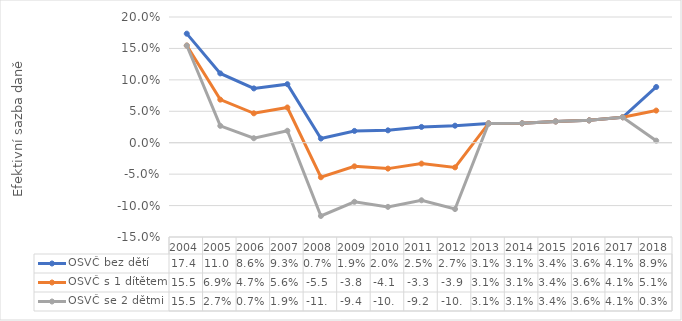
| Category | OSVČ bez dětí | OSVČ s 1 dítětem | OSVČ se 2 dětmi |
|---|---|---|---|
| 2004.0 | 0.174 | 0.155 | 0.155 |
| 2005.0 | 0.11 | 0.069 | 0.027 |
| 2006.0 | 0.086 | 0.047 | 0.007 |
| 2007.0 | 0.093 | 0.056 | 0.019 |
| 2008.0 | 0.007 | -0.055 | -0.117 |
| 2009.0 | 0.019 | -0.038 | -0.094 |
| 2010.0 | 0.02 | -0.041 | -0.102 |
| 2011.0 | 0.025 | -0.033 | -0.092 |
| 2012.0 | 0.027 | -0.039 | -0.106 |
| 2013.0 | 0.031 | 0.031 | 0.031 |
| 2014.0 | 0.031 | 0.031 | 0.031 |
| 2015.0 | 0.034 | 0.034 | 0.034 |
| 2016.0 | 0.036 | 0.036 | 0.036 |
| 2017.0 | 0.041 | 0.041 | 0.041 |
| 2018.0 | 0.089 | 0.051 | 0.003 |